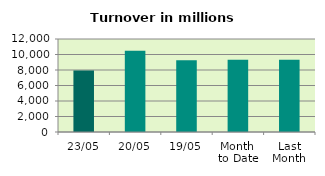
| Category | Series 0 |
|---|---|
| 23/05 | 7939.88 |
| 20/05 | 10496.781 |
| 19/05 | 9273.83 |
| Month 
to Date | 9333.331 |
| Last
Month | 9311.354 |